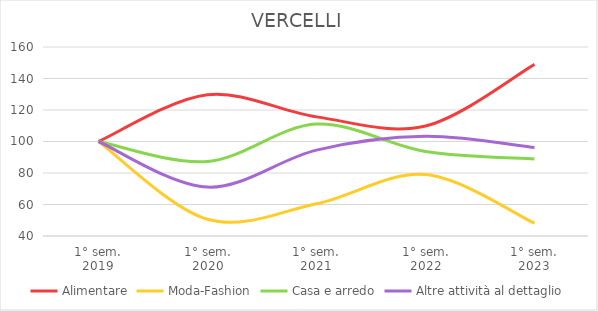
| Category | Alimentare | Moda-Fashion | Casa e arredo | Altre attività al dettaglio |
|---|---|---|---|---|
| 1° sem.
2019 | 100 | 100 | 100 | 100 |
| 1° sem.
2020 | 129.63 | 50.617 | 87.302 | 71.038 |
| 1° sem.
2021 | 115.638 | 60.494 | 111.111 | 94.536 |
| 1° sem.
2022 | 109.877 | 79.012 | 93.651 | 103.279 |
| 1° sem.
2023 | 148.971 | 48.148 | 88.889 | 96.175 |